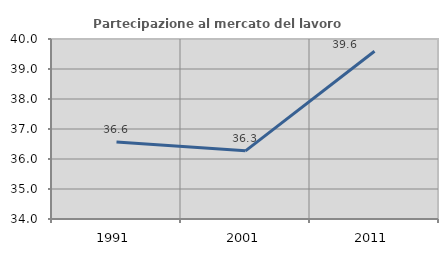
| Category | Partecipazione al mercato del lavoro  femminile |
|---|---|
| 1991.0 | 36.57 |
| 2001.0 | 36.272 |
| 2011.0 | 39.59 |